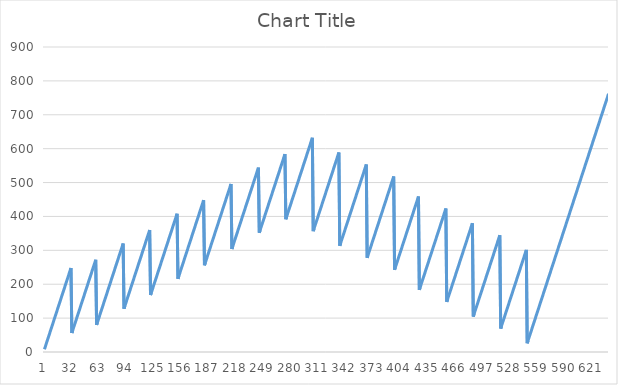
| Category | Series 0 |
|---|---|
| 0 | 8 |
| 1 | 16 |
| 2 | 24 |
| 3 | 32 |
| 4 | 40 |
| 5 | 48 |
| 6 | 56 |
| 7 | 64 |
| 8 | 72 |
| 9 | 80 |
| 10 | 88 |
| 11 | 96 |
| 12 | 104 |
| 13 | 112 |
| 14 | 120 |
| 15 | 128 |
| 16 | 136 |
| 17 | 144 |
| 18 | 152 |
| 19 | 160 |
| 20 | 168 |
| 21 | 176 |
| 22 | 184 |
| 23 | 192 |
| 24 | 200 |
| 25 | 208 |
| 26 | 216 |
| 27 | 224 |
| 28 | 232 |
| 29 | 240 |
| 30 | 248 |
| 31 | 56 |
| 32 | 64 |
| 33 | 72 |
| 34 | 80 |
| 35 | 88 |
| 36 | 96 |
| 37 | 104 |
| 38 | 112 |
| 39 | 120 |
| 40 | 128 |
| 41 | 136 |
| 42 | 144 |
| 43 | 152 |
| 44 | 160 |
| 45 | 168 |
| 46 | 176 |
| 47 | 184 |
| 48 | 192 |
| 49 | 200 |
| 50 | 208 |
| 51 | 216 |
| 52 | 224 |
| 53 | 232 |
| 54 | 240 |
| 55 | 248 |
| 56 | 256 |
| 57 | 264 |
| 58 | 272 |
| 59 | 80 |
| 60 | 88 |
| 61 | 96 |
| 62 | 104 |
| 63 | 112 |
| 64 | 120 |
| 65 | 128 |
| 66 | 136 |
| 67 | 144 |
| 68 | 152 |
| 69 | 160 |
| 70 | 168 |
| 71 | 176 |
| 72 | 184 |
| 73 | 192 |
| 74 | 200 |
| 75 | 208 |
| 76 | 216 |
| 77 | 224 |
| 78 | 232 |
| 79 | 240 |
| 80 | 248 |
| 81 | 256 |
| 82 | 264 |
| 83 | 272 |
| 84 | 280 |
| 85 | 288 |
| 86 | 296 |
| 87 | 304 |
| 88 | 312 |
| 89 | 320 |
| 90 | 128 |
| 91 | 136 |
| 92 | 144 |
| 93 | 152 |
| 94 | 160 |
| 95 | 168 |
| 96 | 176 |
| 97 | 184 |
| 98 | 192 |
| 99 | 200 |
| 100 | 208 |
| 101 | 216 |
| 102 | 224 |
| 103 | 232 |
| 104 | 240 |
| 105 | 248 |
| 106 | 256 |
| 107 | 264 |
| 108 | 272 |
| 109 | 280 |
| 110 | 288 |
| 111 | 296 |
| 112 | 304 |
| 113 | 312 |
| 114 | 320 |
| 115 | 328 |
| 116 | 336 |
| 117 | 344 |
| 118 | 352 |
| 119 | 360 |
| 120 | 168 |
| 121 | 176 |
| 122 | 184 |
| 123 | 192 |
| 124 | 200 |
| 125 | 208 |
| 126 | 216 |
| 127 | 224 |
| 128 | 232 |
| 129 | 240 |
| 130 | 248 |
| 131 | 256 |
| 132 | 264 |
| 133 | 272 |
| 134 | 280 |
| 135 | 288 |
| 136 | 296 |
| 137 | 304 |
| 138 | 312 |
| 139 | 320 |
| 140 | 328 |
| 141 | 336 |
| 142 | 344 |
| 143 | 352 |
| 144 | 360 |
| 145 | 368 |
| 146 | 376 |
| 147 | 384 |
| 148 | 392 |
| 149 | 400 |
| 150 | 408 |
| 151 | 216 |
| 152 | 224 |
| 153 | 232 |
| 154 | 240 |
| 155 | 248 |
| 156 | 256 |
| 157 | 264 |
| 158 | 272 |
| 159 | 280 |
| 160 | 288 |
| 161 | 296 |
| 162 | 304 |
| 163 | 312 |
| 164 | 320 |
| 165 | 328 |
| 166 | 336 |
| 167 | 344 |
| 168 | 352 |
| 169 | 360 |
| 170 | 368 |
| 171 | 376 |
| 172 | 384 |
| 173 | 392 |
| 174 | 400 |
| 175 | 408 |
| 176 | 416 |
| 177 | 424 |
| 178 | 432 |
| 179 | 440 |
| 180 | 448 |
| 181 | 256 |
| 182 | 264 |
| 183 | 272 |
| 184 | 280 |
| 185 | 288 |
| 186 | 296 |
| 187 | 304 |
| 188 | 312 |
| 189 | 320 |
| 190 | 328 |
| 191 | 336 |
| 192 | 344 |
| 193 | 352 |
| 194 | 360 |
| 195 | 368 |
| 196 | 376 |
| 197 | 384 |
| 198 | 392 |
| 199 | 400 |
| 200 | 408 |
| 201 | 416 |
| 202 | 424 |
| 203 | 432 |
| 204 | 440 |
| 205 | 448 |
| 206 | 456 |
| 207 | 464 |
| 208 | 472 |
| 209 | 480 |
| 210 | 488 |
| 211 | 496 |
| 212 | 304 |
| 213 | 312 |
| 214 | 320 |
| 215 | 328 |
| 216 | 336 |
| 217 | 344 |
| 218 | 352 |
| 219 | 360 |
| 220 | 368 |
| 221 | 376 |
| 222 | 384 |
| 223 | 392 |
| 224 | 400 |
| 225 | 408 |
| 226 | 416 |
| 227 | 424 |
| 228 | 432 |
| 229 | 440 |
| 230 | 448 |
| 231 | 456 |
| 232 | 464 |
| 233 | 472 |
| 234 | 480 |
| 235 | 488 |
| 236 | 496 |
| 237 | 504 |
| 238 | 512 |
| 239 | 520 |
| 240 | 528 |
| 241 | 536 |
| 242 | 544 |
| 243 | 352 |
| 244 | 360 |
| 245 | 368 |
| 246 | 376 |
| 247 | 384 |
| 248 | 392 |
| 249 | 400 |
| 250 | 408 |
| 251 | 416 |
| 252 | 424 |
| 253 | 432 |
| 254 | 440 |
| 255 | 448 |
| 256 | 456 |
| 257 | 464 |
| 258 | 472 |
| 259 | 480 |
| 260 | 488 |
| 261 | 496 |
| 262 | 504 |
| 263 | 512 |
| 264 | 520 |
| 265 | 528 |
| 266 | 536 |
| 267 | 544 |
| 268 | 552 |
| 269 | 560 |
| 270 | 568 |
| 271 | 576 |
| 272 | 584 |
| 273 | 392 |
| 274 | 400 |
| 275 | 408 |
| 276 | 416 |
| 277 | 424 |
| 278 | 432 |
| 279 | 440 |
| 280 | 448 |
| 281 | 456 |
| 282 | 464 |
| 283 | 472 |
| 284 | 480 |
| 285 | 488 |
| 286 | 496 |
| 287 | 504 |
| 288 | 512 |
| 289 | 520 |
| 290 | 528 |
| 291 | 536 |
| 292 | 544 |
| 293 | 552 |
| 294 | 560 |
| 295 | 568 |
| 296 | 576 |
| 297 | 584 |
| 298 | 592 |
| 299 | 600 |
| 300 | 608 |
| 301 | 616 |
| 302 | 624 |
| 303 | 632 |
| 304 | 356.667 |
| 305 | 364.667 |
| 306 | 372.667 |
| 307 | 380.667 |
| 308 | 388.667 |
| 309 | 396.667 |
| 310 | 404.667 |
| 311 | 412.667 |
| 312 | 420.667 |
| 313 | 428.667 |
| 314 | 436.667 |
| 315 | 444.667 |
| 316 | 452.667 |
| 317 | 460.667 |
| 318 | 468.667 |
| 319 | 476.667 |
| 320 | 484.667 |
| 321 | 492.667 |
| 322 | 500.667 |
| 323 | 508.667 |
| 324 | 516.667 |
| 325 | 524.667 |
| 326 | 532.667 |
| 327 | 540.667 |
| 328 | 548.667 |
| 329 | 556.667 |
| 330 | 564.667 |
| 331 | 572.667 |
| 332 | 580.667 |
| 333 | 588.667 |
| 334 | 313.333 |
| 335 | 321.333 |
| 336 | 329.333 |
| 337 | 337.333 |
| 338 | 345.333 |
| 339 | 353.333 |
| 340 | 361.333 |
| 341 | 369.333 |
| 342 | 377.333 |
| 343 | 385.333 |
| 344 | 393.333 |
| 345 | 401.333 |
| 346 | 409.333 |
| 347 | 417.333 |
| 348 | 425.333 |
| 349 | 433.333 |
| 350 | 441.333 |
| 351 | 449.333 |
| 352 | 457.333 |
| 353 | 465.333 |
| 354 | 473.333 |
| 355 | 481.333 |
| 356 | 489.333 |
| 357 | 497.333 |
| 358 | 505.333 |
| 359 | 513.333 |
| 360 | 521.333 |
| 361 | 529.333 |
| 362 | 537.333 |
| 363 | 545.333 |
| 364 | 553.333 |
| 365 | 278 |
| 366 | 286 |
| 367 | 294 |
| 368 | 302 |
| 369 | 310 |
| 370 | 318 |
| 371 | 326 |
| 372 | 334 |
| 373 | 342 |
| 374 | 350 |
| 375 | 358 |
| 376 | 366 |
| 377 | 374 |
| 378 | 382 |
| 379 | 390 |
| 380 | 398 |
| 381 | 406 |
| 382 | 414 |
| 383 | 422 |
| 384 | 430 |
| 385 | 438 |
| 386 | 446 |
| 387 | 454 |
| 388 | 462 |
| 389 | 470 |
| 390 | 478 |
| 391 | 486 |
| 392 | 494 |
| 393 | 502 |
| 394 | 510 |
| 395 | 518 |
| 396 | 242.667 |
| 397 | 250.667 |
| 398 | 258.667 |
| 399 | 266.667 |
| 400 | 274.667 |
| 401 | 282.667 |
| 402 | 290.667 |
| 403 | 298.667 |
| 404 | 306.667 |
| 405 | 314.667 |
| 406 | 322.667 |
| 407 | 330.667 |
| 408 | 338.667 |
| 409 | 346.667 |
| 410 | 354.667 |
| 411 | 362.667 |
| 412 | 370.667 |
| 413 | 378.667 |
| 414 | 386.667 |
| 415 | 394.667 |
| 416 | 402.667 |
| 417 | 410.667 |
| 418 | 418.667 |
| 419 | 426.667 |
| 420 | 434.667 |
| 421 | 442.667 |
| 422 | 450.667 |
| 423 | 458.667 |
| 424 | 183.333 |
| 425 | 191.333 |
| 426 | 199.333 |
| 427 | 207.333 |
| 428 | 215.333 |
| 429 | 223.333 |
| 430 | 231.333 |
| 431 | 239.333 |
| 432 | 247.333 |
| 433 | 255.333 |
| 434 | 263.333 |
| 435 | 271.333 |
| 436 | 279.333 |
| 437 | 287.333 |
| 438 | 295.333 |
| 439 | 303.333 |
| 440 | 311.333 |
| 441 | 319.333 |
| 442 | 327.333 |
| 443 | 335.333 |
| 444 | 343.333 |
| 445 | 351.333 |
| 446 | 359.333 |
| 447 | 367.333 |
| 448 | 375.333 |
| 449 | 383.333 |
| 450 | 391.333 |
| 451 | 399.333 |
| 452 | 407.333 |
| 453 | 415.333 |
| 454 | 423.333 |
| 455 | 148 |
| 456 | 156 |
| 457 | 164 |
| 458 | 172 |
| 459 | 180 |
| 460 | 188 |
| 461 | 196 |
| 462 | 204 |
| 463 | 212 |
| 464 | 220 |
| 465 | 228 |
| 466 | 236 |
| 467 | 244 |
| 468 | 252 |
| 469 | 260 |
| 470 | 268 |
| 471 | 276 |
| 472 | 284 |
| 473 | 292 |
| 474 | 300 |
| 475 | 308 |
| 476 | 316 |
| 477 | 324 |
| 478 | 332 |
| 479 | 340 |
| 480 | 348 |
| 481 | 356 |
| 482 | 364 |
| 483 | 372 |
| 484 | 380 |
| 485 | 104.667 |
| 486 | 112.667 |
| 487 | 120.667 |
| 488 | 128.667 |
| 489 | 136.667 |
| 490 | 144.667 |
| 491 | 152.667 |
| 492 | 160.667 |
| 493 | 168.667 |
| 494 | 176.667 |
| 495 | 184.667 |
| 496 | 192.667 |
| 497 | 200.667 |
| 498 | 208.667 |
| 499 | 216.667 |
| 500 | 224.667 |
| 501 | 232.667 |
| 502 | 240.667 |
| 503 | 248.667 |
| 504 | 256.667 |
| 505 | 264.667 |
| 506 | 272.667 |
| 507 | 280.667 |
| 508 | 288.667 |
| 509 | 296.667 |
| 510 | 304.667 |
| 511 | 312.667 |
| 512 | 320.667 |
| 513 | 328.667 |
| 514 | 336.667 |
| 515 | 344.667 |
| 516 | 69.333 |
| 517 | 77.333 |
| 518 | 85.333 |
| 519 | 93.333 |
| 520 | 101.333 |
| 521 | 109.333 |
| 522 | 117.333 |
| 523 | 125.333 |
| 524 | 133.333 |
| 525 | 141.333 |
| 526 | 149.333 |
| 527 | 157.333 |
| 528 | 165.333 |
| 529 | 173.333 |
| 530 | 181.333 |
| 531 | 189.333 |
| 532 | 197.333 |
| 533 | 205.333 |
| 534 | 213.333 |
| 535 | 221.333 |
| 536 | 229.333 |
| 537 | 237.333 |
| 538 | 245.333 |
| 539 | 253.333 |
| 540 | 261.333 |
| 541 | 269.333 |
| 542 | 277.333 |
| 543 | 285.333 |
| 544 | 293.333 |
| 545 | 301.333 |
| 546 | 26 |
| 547 | 34 |
| 548 | 42 |
| 549 | 50 |
| 550 | 58 |
| 551 | 66 |
| 552 | 74 |
| 553 | 82 |
| 554 | 90 |
| 555 | 98 |
| 556 | 106 |
| 557 | 114 |
| 558 | 122 |
| 559 | 130 |
| 560 | 138 |
| 561 | 146 |
| 562 | 154 |
| 563 | 162 |
| 564 | 170 |
| 565 | 178 |
| 566 | 186 |
| 567 | 194 |
| 568 | 202 |
| 569 | 210 |
| 570 | 218 |
| 571 | 226 |
| 572 | 234 |
| 573 | 242 |
| 574 | 250 |
| 575 | 258 |
| 576 | 266 |
| 577 | 274 |
| 578 | 282 |
| 579 | 290 |
| 580 | 298 |
| 581 | 306 |
| 582 | 314 |
| 583 | 322 |
| 584 | 330 |
| 585 | 338 |
| 586 | 346 |
| 587 | 354 |
| 588 | 362 |
| 589 | 370 |
| 590 | 378 |
| 591 | 386 |
| 592 | 394 |
| 593 | 402 |
| 594 | 410 |
| 595 | 418 |
| 596 | 426 |
| 597 | 434 |
| 598 | 442 |
| 599 | 450 |
| 600 | 458 |
| 601 | 466 |
| 602 | 474 |
| 603 | 482 |
| 604 | 490 |
| 605 | 498 |
| 606 | 506 |
| 607 | 514 |
| 608 | 522 |
| 609 | 530 |
| 610 | 538 |
| 611 | 546 |
| 612 | 554 |
| 613 | 562 |
| 614 | 570 |
| 615 | 578 |
| 616 | 586 |
| 617 | 594 |
| 618 | 602 |
| 619 | 610 |
| 620 | 618 |
| 621 | 626 |
| 622 | 634 |
| 623 | 642 |
| 624 | 650 |
| 625 | 658 |
| 626 | 666 |
| 627 | 674 |
| 628 | 682 |
| 629 | 690 |
| 630 | 698 |
| 631 | 706 |
| 632 | 714 |
| 633 | 722 |
| 634 | 730 |
| 635 | 738 |
| 636 | 746 |
| 637 | 754 |
| 638 | 762 |